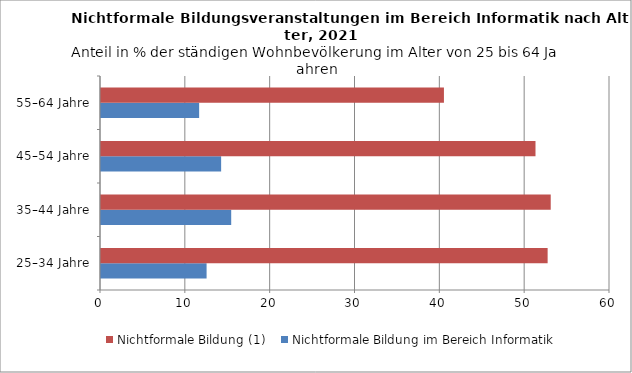
| Category | Nichtformale Bildung im Bereich Informatik | Nichtformale Bildung (1) |
|---|---|---|
| 25–34 Jahre | 12.447 | 52.648 |
| 35–44 Jahre | 15.348 | 53.013 |
| 45–54 Jahre | 14.161 | 51.217 |
| 55–64 Jahre | 11.569 | 40.424 |